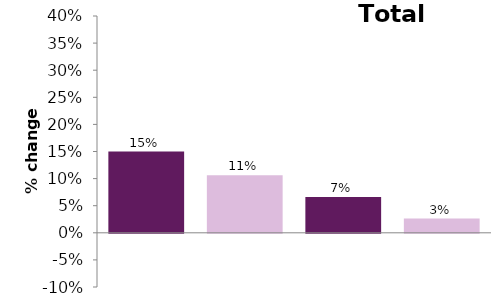
| Category | Total |
|---|---|
| 0 | 0.15 |
| 1 | 0.106 |
| 2 | 0.066 |
| 3 | 0.026 |